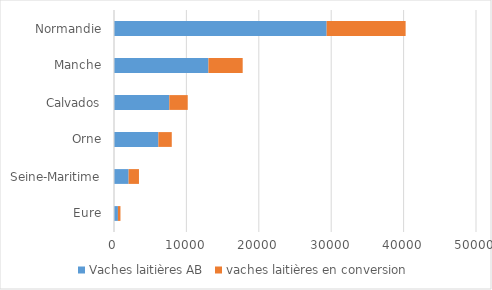
| Category | Vaches laitières AB | vaches laitières en conversion |
|---|---|---|
| Eure | 541 | 351 |
| Seine-Maritime | 2020 | 1429 |
| Orne | 6128 | 1852 |
| Calvados | 7637 | 2547 |
| Manche | 13046 | 4728 |
| Normandie | 29372 | 10907 |